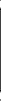
| Category | Series 0 |
|---|---|
| 2h.1 | -1.17 |
| 2h.2 | -1.83 |
| 6h.1 | -2.86 |
| 6h.2 | -3.83 |
| 30h.1 | -3.95 |
| 30h.2 | -4.89 |